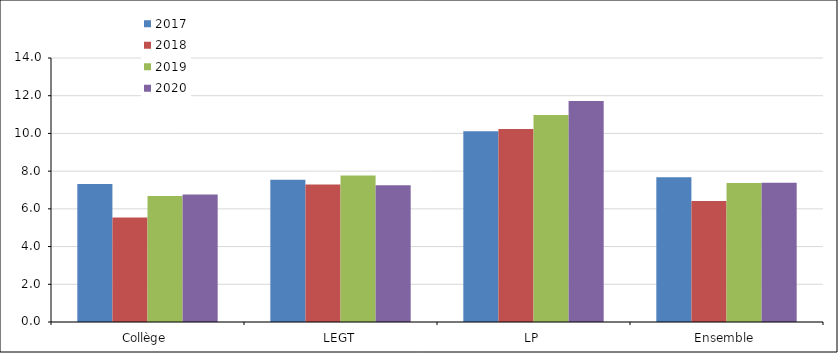
| Category | 2017 | 2018 | 2019 | 2020 |
|---|---|---|---|---|
| Collège | 7.32 | 5.54 | 6.683 | 6.766 |
| LEGT | 7.549 | 7.295 | 7.767 | 7.251 |
| LP | 10.115 | 10.229 | 10.973 | 11.724 |
| Ensemble | 7.68 | 6.416 | 7.37 | 7.385 |